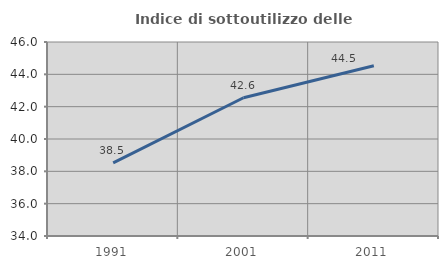
| Category | Indice di sottoutilizzo delle abitazioni  |
|---|---|
| 1991.0 | 38.524 |
| 2001.0 | 42.552 |
| 2011.0 | 44.53 |